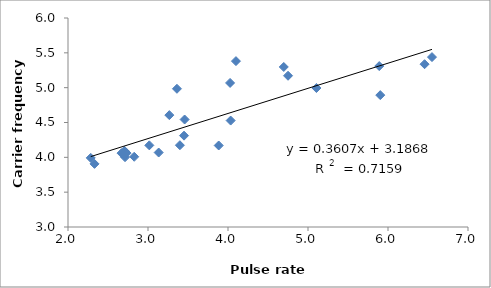
| Category | Series 0 |
|---|---|
| 3.2666394446712945 | 4.606 |
| 2.7129402129402127 | 4.002 |
| 2.284263959390863 | 3.992 |
| 2.3312740412635504 | 3.906 |
| 3.133743704532736 | 4.069 |
| 3.4577322046023604 | 4.543 |
| 4.03327451474666 | 4.528 |
| 3.016773259321829 | 4.172 |
| 2.669371629918317 | 4.06 |
| 3.450554291168049 | 4.311 |
| 2.7060782681099083 | 4.093 |
| 3.884075291305647 | 4.17 |
| 3.3987915407854983 | 4.174 |
| 2.8277344191833507 | 4.008 |
| 5.105296745373325 | 4.995 |
| 4.697116942014901 | 5.297 |
| 5.903490759753594 | 4.893 |
| 4.750142504275129 | 5.171 |
| 4.026170105686965 | 5.068 |
| 6.549831828642238 | 5.439 |
| 6.457046603032005 | 5.337 |
| 4.099320684000937 | 5.381 |
| 5.89043785588062 | 5.31 |
| 3.361934868784184 | 4.984 |
| 2.7327935222672064 | 4.061 |